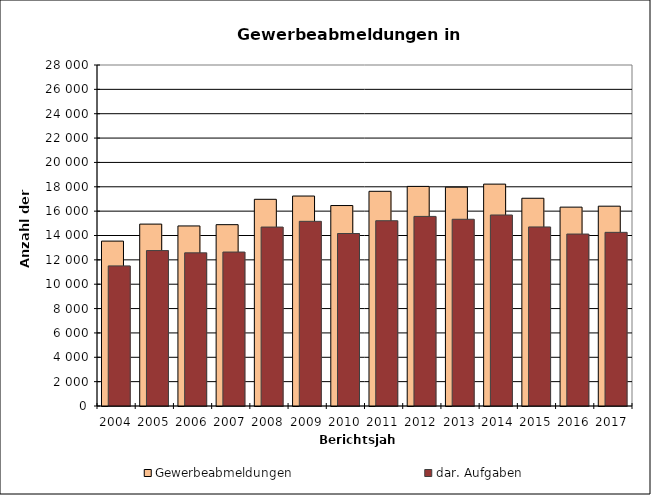
| Category | Gewerbeabmeldungen | dar. Aufgaben |
|---|---|---|
| 2004.0 | 13540 | 11504 |
| 2005.0 | 14936 | 12763 |
| 2006.0 | 14785 | 12576 |
| 2007.0 | 14890 | 12642 |
| 2008.0 | 16972 | 14693 |
| 2009.0 | 17240 | 15163 |
| 2010.0 | 16460 | 14163 |
| 2011.0 | 17629 | 15213 |
| 2012.0 | 18032 | 15567 |
| 2013.0 | 17968 | 15333 |
| 2014.0 | 18219 | 15684 |
| 2015.0 | 17058 | 14703 |
| 2016.0 | 16329 | 14120 |
| 2017.0 | 16407 | 14259 |